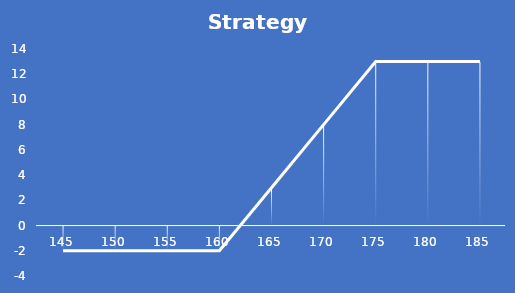
| Category | Profit |
|---|---|
| 145.0 | -2 |
| 150.0 | -2 |
| 155.0 | -2 |
| 160.0 | -2 |
| 165.0 | 3 |
| 170.0 | 8 |
| 175.0 | 13 |
| 180.0 | 13 |
| 185.0 | 13 |